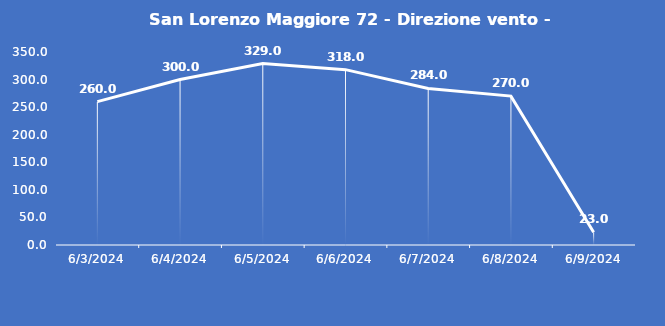
| Category | San Lorenzo Maggiore 72 - Direzione vento - Grezzo (°N) |
|---|---|
| 6/3/24 | 260 |
| 6/4/24 | 300 |
| 6/5/24 | 329 |
| 6/6/24 | 318 |
| 6/7/24 | 284 |
| 6/8/24 | 270 |
| 6/9/24 | 23 |